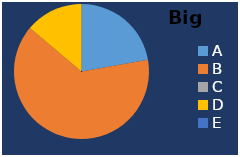
| Category | Big basket |
|---|---|
| A | 40 |
| B | 115 |
| C | 0 |
| D | 25 |
| E | 0 |